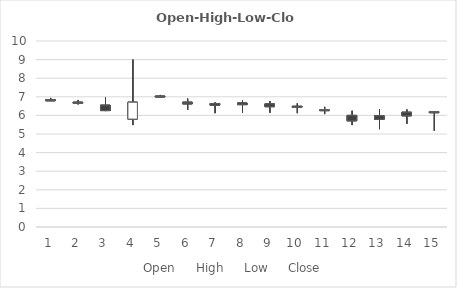
| Category | Open | High | Low | Close |
|---|---|---|---|---|
| 0 | 6.84 | 6.94 | 6.81 | 6.82 |
| 1 | 6.71 | 6.83 | 6.59 | 6.68 |
| 2 | 6.55 | 6.98 | 6.23 | 6.26 |
| 3 | 5.8 | 9 | 5.48 | 6.71 |
| 4 | 7.04 | 7.1 | 7.01 | 7.04 |
| 5 | 6.71 | 6.9 | 6.29 | 6.62 |
| 6 | 6.64 | 6.71 | 6.12 | 6.55 |
| 7 | 6.67 | 6.8 | 6.15 | 6.58 |
| 8 | 6.62 | 6.77 | 6.14 | 6.47 |
| 9 | 6.49 | 6.65 | 6.12 | 6.45 |
| 10 | 6.29 | 6.46 | 6.07 | 6.31 |
| 11 | 6 | 6.25 | 5.48 | 5.71 |
| 12 | 5.98 | 6.33 | 5.26 | 5.79 |
| 13 | 6.17 | 6.32 | 5.55 | 5.98 |
| 14 | 6.19 | 6.23 | 5.17 | 6.2 |